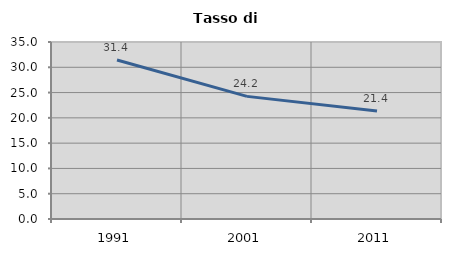
| Category | Tasso di disoccupazione   |
|---|---|
| 1991.0 | 31.439 |
| 2001.0 | 24.248 |
| 2011.0 | 21.358 |